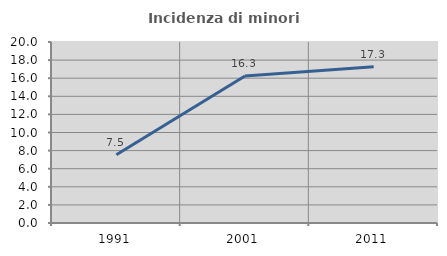
| Category | Incidenza di minori stranieri |
|---|---|
| 1991.0 | 7.547 |
| 2001.0 | 16.25 |
| 2011.0 | 17.273 |